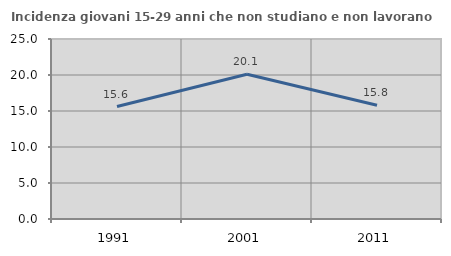
| Category | Incidenza giovani 15-29 anni che non studiano e non lavorano  |
|---|---|
| 1991.0 | 15.625 |
| 2001.0 | 20.105 |
| 2011.0 | 15.795 |